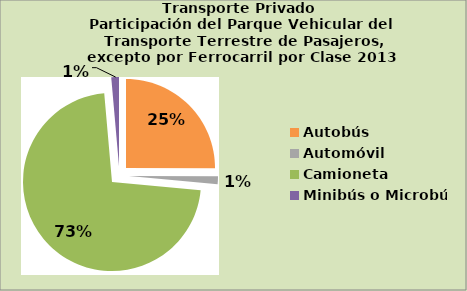
| Category | Series 0 |
|---|---|
| Autobús | 25.065 |
| Automóvil | 1.393 |
| Camioneta | 72.15 |
| Minibús o Microbús | 1.393 |